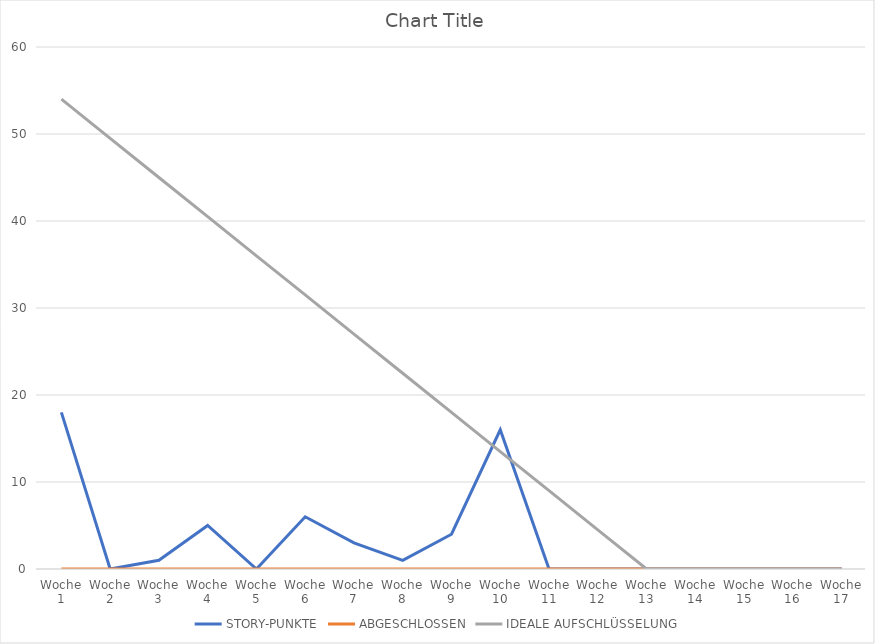
| Category | STORY-PUNKTE | ABGESCHLOSSEN | IDEALE AUFSCHLÜSSELUNG |
|---|---|---|---|
| Woche 1 | 18 | 0 | 54 |
| Woche 2 | 0 | 0 | 49.5 |
| Woche 3 | 1 | 0 | 45 |
| Woche 4 | 5 | 0 | 40.5 |
| Woche 5 | 0 | 0 | 36 |
| Woche 6 | 6 | 0 | 31.5 |
| Woche 7 | 3 | 0 | 27 |
| Woche 8 | 1 | 0 | 22.5 |
| Woche 9 | 4 | 0 | 18 |
| Woche 10 | 16 | 0 | 13.5 |
| Woche 11 | 0 | 0 | 9 |
| Woche 12 | 0 | 0 | 4.5 |
| Woche 13 | 0 | 0 | 0 |
| Woche 14 | 0 | 0 | 0 |
| Woche 15 | 0 | 0 | 0 |
| Woche 16 | 0 | 0 | 0 |
| Woche 17 | 0 | 0 | 0 |